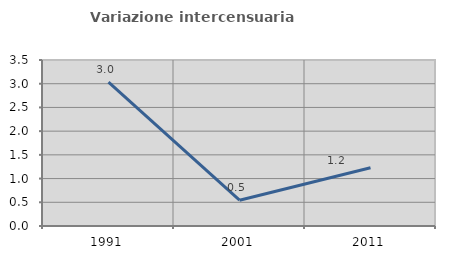
| Category | Variazione intercensuaria annua |
|---|---|
| 1991.0 | 3.032 |
| 2001.0 | 0.544 |
| 2011.0 | 1.229 |